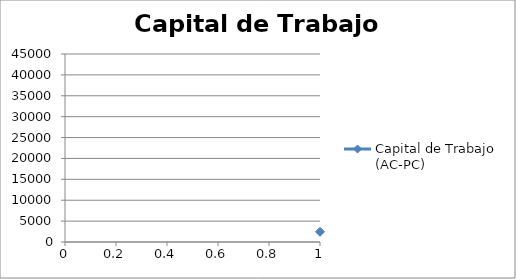
| Category | Capital de Trabajo (AC-PC) |
|---|---|
| 0 | 2446.303 |
| 1 | 28690.316 |
| 2 | 28760.579 |
| 3 | 31466.69 |
| 4 | 25766.597 |
| 5 | 41845.698 |
| 6 | 37597.842 |
| 7 | 20734.25 |